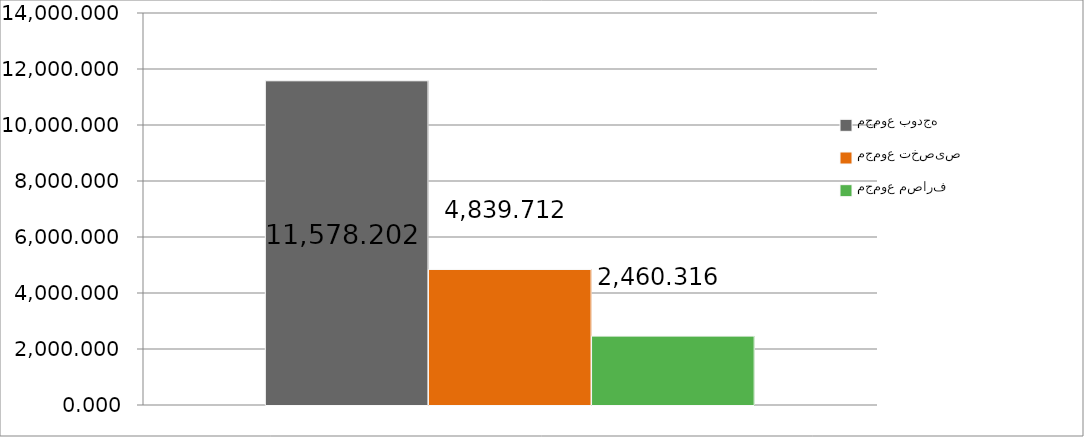
| Category | مجموع بودجه  | مجموع تخصیص | مجموع مصارف |
|---|---|---|---|
| 0 | 11578.202 | 4839.712 | 2460.316 |